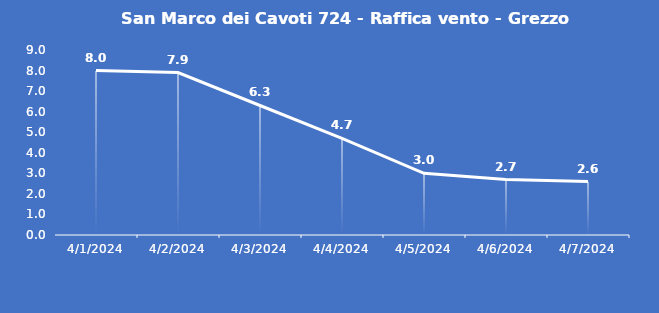
| Category | San Marco dei Cavoti 724 - Raffica vento - Grezzo (m/s) |
|---|---|
| 4/1/24 | 8 |
| 4/2/24 | 7.9 |
| 4/3/24 | 6.3 |
| 4/4/24 | 4.7 |
| 4/5/24 | 3 |
| 4/6/24 | 2.7 |
| 4/7/24 | 2.6 |